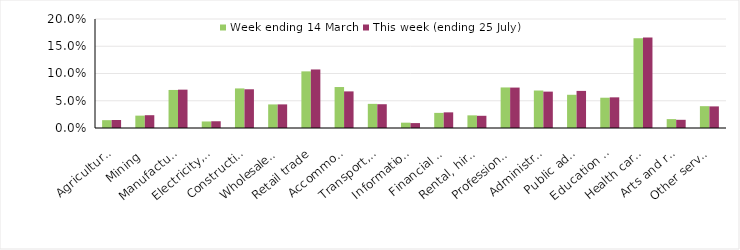
| Category | Week ending 14 March | This week (ending 25 July) |
|---|---|---|
| Agriculture, forestry and fishing | 0.014 | 0.015 |
| Mining | 0.023 | 0.023 |
| Manufacturing | 0.07 | 0.07 |
| Electricity, gas, water and waste services | 0.012 | 0.012 |
| Construction | 0.073 | 0.071 |
| Wholesale trade | 0.043 | 0.043 |
| Retail trade | 0.104 | 0.107 |
| Accommodation and food services | 0.075 | 0.067 |
| Transport, postal and warehousing | 0.044 | 0.044 |
| Information media and telecommunications | 0.01 | 0.009 |
| Financial and insurance services | 0.028 | 0.029 |
| Rental, hiring and real estate services | 0.023 | 0.022 |
| Professional, scientific and technical services | 0.074 | 0.074 |
| Administrative and support services | 0.069 | 0.067 |
| Public administration and safety | 0.061 | 0.068 |
| Education and training | 0.056 | 0.056 |
| Health care and social assistance | 0.165 | 0.166 |
| Arts and recreation services | 0.016 | 0.015 |
| Other services | 0.04 | 0.04 |